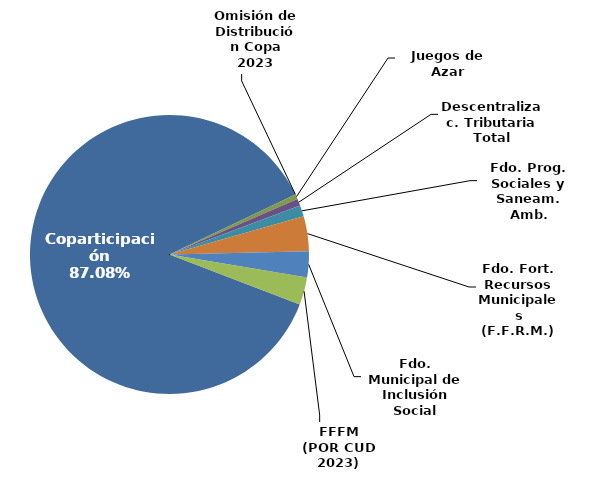
| Category | Series 0 |
|---|---|
| Coparticipación | 317154289245.4 |
| Omisión de Distribución Copa 2023 | 9184817.67 |
| Juegos de Azar | 2094224463.31 |
| Descentralizac. Tributaria Total | 2860831033.027 |
| Fdo. Prog. Sociales y Saneam. Amb. | 4811603339.79 |
| Fdo. Fort. Recursos Municipales (F.F.R.M.) | 14658092802.61 |
| Fdo. Municipal de Inclusión Social (F.M.I.S.) | 11035052194.49 |
| Fdo. de Financiamiento Educativo (F.F.E.) | 0 |
| FFFM
(POR CUD 2023) | 11600000000 |
| Fdo. Infraestructura Municipal (F.I.M.) 2017 | 0 |
| Fdo. Ley 14890 | 0 |
| Fdo Compensador 
Decreto PEN 836/18 | 0 |